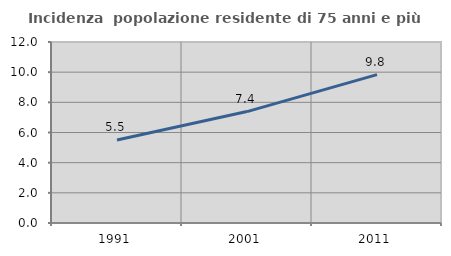
| Category | Incidenza  popolazione residente di 75 anni e più |
|---|---|
| 1991.0 | 5.499 |
| 2001.0 | 7.387 |
| 2011.0 | 9.834 |